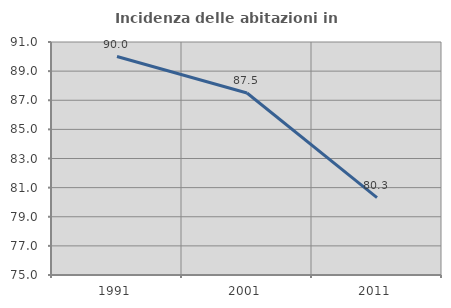
| Category | Incidenza delle abitazioni in proprietà  |
|---|---|
| 1991.0 | 90 |
| 2001.0 | 87.5 |
| 2011.0 | 80.315 |